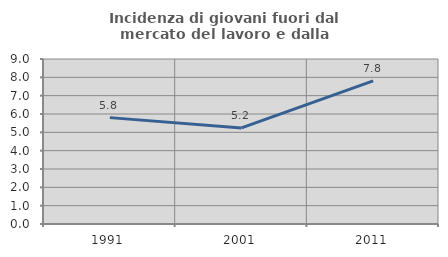
| Category | Incidenza di giovani fuori dal mercato del lavoro e dalla formazione  |
|---|---|
| 1991.0 | 5.802 |
| 2001.0 | 5.242 |
| 2011.0 | 7.804 |